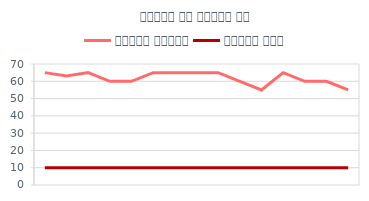
| Category | स्थिर नाड़ी | श्वास गति |
|---|---|---|
| 6/1/12 | 65 | 10 |
| 6/2/12 | 63 | 10 |
| 6/3/12 | 65 | 10 |
| 6/4/12 | 60 | 10 |
| 6/5/12 | 60 | 10 |
| 6/6/12 | 65 | 10 |
| 6/7/12 | 65 | 10 |
| 6/8/12 | 65 | 10 |
| 6/9/12 | 65 | 10 |
| 6/10/12 | 60 | 10 |
| 6/11/12 | 55 | 10 |
| 6/12/12 | 65 | 10 |
| 6/13/12 | 60 | 10 |
| 6/14/12 | 60 | 10 |
| 6/15/12 | 55 | 10 |